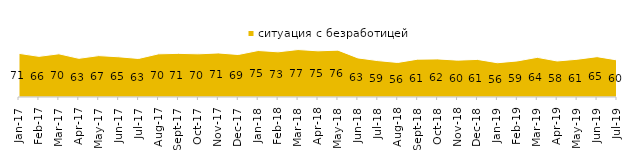
| Category | ситуация с безработицей |
|---|---|
| 2017-01-01 | 70.75 |
| 2017-02-01 | 65.9 |
| 2017-03-01 | 70.05 |
| 2017-04-01 | 62.7 |
| 2017-05-01 | 67.1 |
| 2017-06-01 | 65.2 |
| 2017-07-01 | 62.5 |
| 2017-08-01 | 70 |
| 2017-09-01 | 70.75 |
| 2017-10-01 | 70 |
| 2017-11-01 | 71.45 |
| 2017-12-01 | 68.9 |
| 2018-01-01 | 75.4 |
| 2018-02-01 | 73.25 |
| 2018-03-01 | 76.95 |
| 2018-04-01 | 74.85 |
| 2018-05-01 | 76 |
| 2018-06-01 | 63.4 |
| 2018-07-01 | 59 |
| 2018-08-01 | 56 |
| 2018-09-01 | 61.35 |
| 2018-10-01 | 61.75 |
| 2018-11-01 | 59.78 |
| 2018-12-01 | 60.95 |
| 2019-01-01 | 55.55 |
| 2019-02-01 | 58.5 |
| 2019-03-01 | 64.296 |
| 2019-04-01 | 58.416 |
| 2019-05-01 | 61.169 |
| 2019-06-01 | 65.436 |
| 2019-07-01 | 60.099 |